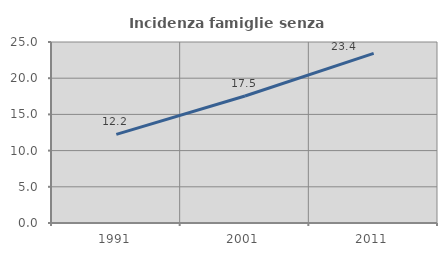
| Category | Incidenza famiglie senza nuclei |
|---|---|
| 1991.0 | 12.242 |
| 2001.0 | 17.545 |
| 2011.0 | 23.427 |